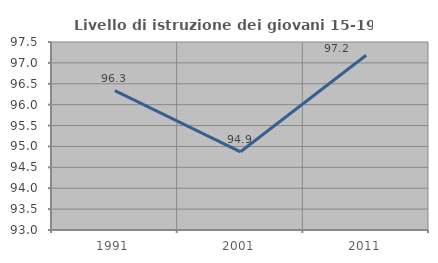
| Category | Livello di istruzione dei giovani 15-19 anni |
|---|---|
| 1991.0 | 96.335 |
| 2001.0 | 94.872 |
| 2011.0 | 97.183 |